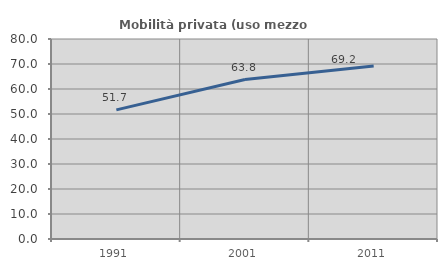
| Category | Mobilità privata (uso mezzo privato) |
|---|---|
| 1991.0 | 51.665 |
| 2001.0 | 63.773 |
| 2011.0 | 69.164 |